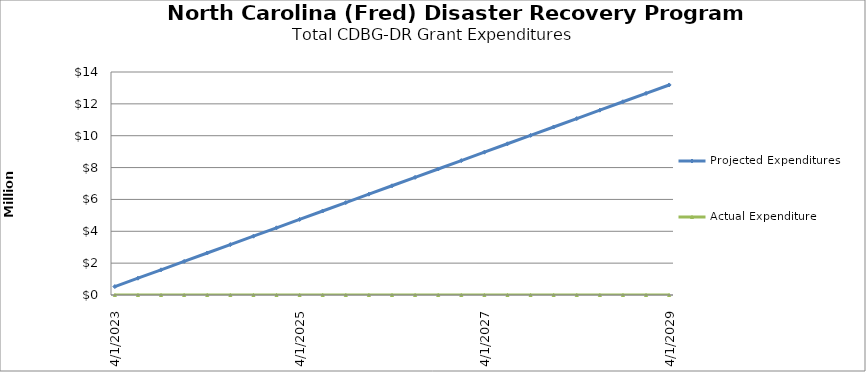
| Category | Projected Expenditures | Actual Expenditure |
|---|---|---|
| 4/1/23 | 527440 | 0 |
| 7/1/23 | 1054880 | 0 |
| 10/1/23 | 1582320 | 0 |
| 1/1/24 | 2109760 | 0 |
| 4/1/24 | 2637200 | 0 |
| 7/1/24 | 3164640 | 0 |
| 10/1/24 | 3692080 | 0 |
| 1/1/25 | 4219520 | 0 |
| 4/1/25 | 4746960 | 0 |
| 7/1/25 | 5274400 | 0 |
| 10/1/25 | 5801840 | 0 |
| 1/1/26 | 6329280 | 0 |
| 4/1/26 | 6856720 | 0 |
| 7/1/26 | 7384160 | 0 |
| 10/1/26 | 7911600 | 0 |
| 1/1/27 | 8439040 | 0 |
| 4/1/27 | 8966480 | 0 |
| 7/1/27 | 9493920 | 0 |
| 10/1/27 | 10021360 | 0 |
| 1/1/28 | 10548800 | 0 |
| 4/1/28 | 11076240 | 0 |
| 7/1/28 | 11603680 | 0 |
| 10/1/28 | 12131120 | 0 |
| 1/1/29 | 12658560 | 0 |
| 4/1/29 | 13186000 | 0 |